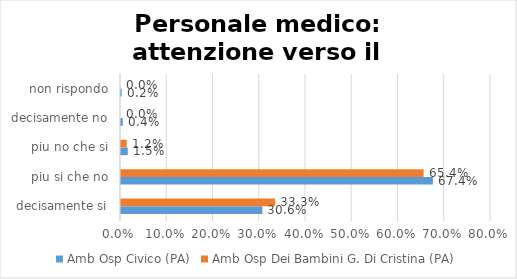
| Category | Amb Osp Civico (PA) | Amb Osp Dei Bambini G. Di Cristina (PA) |
|---|---|---|
| decisamente si | 0.306 | 0.333 |
| piu si che no | 0.674 | 0.654 |
| piu no che si | 0.015 | 0.012 |
| decisamente no | 0.004 | 0 |
| non rispondo | 0.002 | 0 |